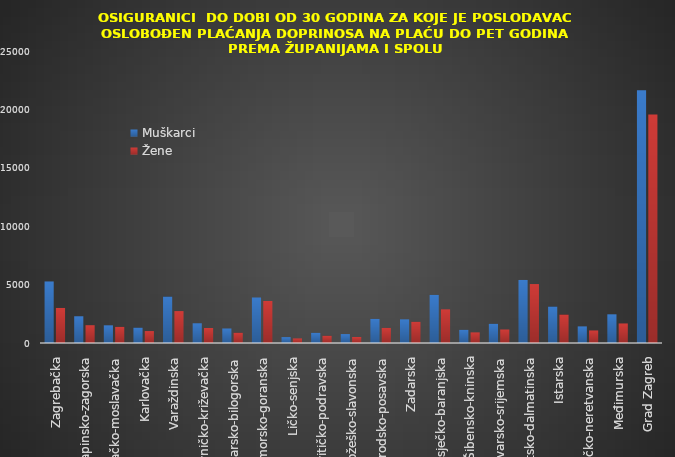
| Category | Muškarci | Žene |
|---|---|---|
| Zagrebačka | 5269 | 3001 |
| Krapinsko-zagorska | 2289 | 1523 |
| Sisačko-moslavačka | 1514 | 1382 |
| Karlovačka | 1316 | 1022 |
| Varaždinska | 3977 | 2733 |
| Koprivničko-križevačka | 1689 | 1284 |
| Bjelovarsko-bilogorska | 1243 | 879 |
| Primorsko-goranska | 3896 | 3597 |
| Ličko-senjska | 505 | 392 |
| Virovitičko-podravska | 871 | 621 |
| Požeško-slavonska | 763 | 516 |
| Brodsko-posavska | 2065 | 1293 |
| Zadarska | 2025 | 1816 |
| Osječko-baranjska | 4120 | 2882 |
| Šibensko-kninska | 1129 | 909 |
| Vukovarsko-srijemska | 1644 | 1156 |
| Splitsko-dalmatinska | 5398 | 5046 |
| Istarska | 3123 | 2438 |
| Dubrovačko-neretvanska | 1422 | 1074 |
| Međimurska | 2456 | 1673 |
| Grad Zagreb | 21645 | 19569 |